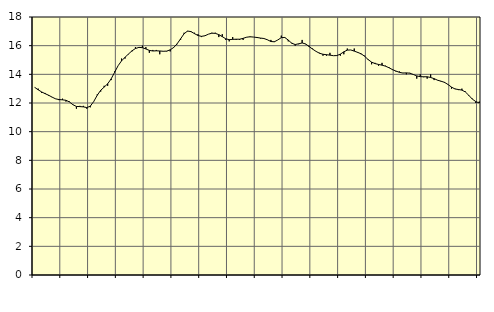
| Category | Piggar | Series 1 |
|---|---|---|
| nan | 13.1 | 13.09 |
| 87.0 | 13 | 12.92 |
| 87.0 | 12.7 | 12.77 |
| 87.0 | 12.7 | 12.65 |
| nan | 12.5 | 12.54 |
| 88.0 | 12.4 | 12.41 |
| 88.0 | 12.3 | 12.29 |
| 88.0 | 12.2 | 12.24 |
| nan | 12.3 | 12.22 |
| 89.0 | 12.1 | 12.19 |
| 89.0 | 12.1 | 12.07 |
| 89.0 | 11.9 | 11.88 |
| nan | 11.6 | 11.76 |
| 90.0 | 11.8 | 11.75 |
| 90.0 | 11.8 | 11.73 |
| 90.0 | 11.6 | 11.68 |
| nan | 11.7 | 11.78 |
| 91.0 | 12.1 | 12.11 |
| 91.0 | 12.6 | 12.54 |
| 91.0 | 12.8 | 12.89 |
| nan | 13.2 | 13.11 |
| 92.0 | 13.2 | 13.34 |
| 92.0 | 13.6 | 13.68 |
| 92.0 | 14.2 | 14.14 |
| nan | 14.6 | 14.6 |
| 93.0 | 15.1 | 14.94 |
| 93.0 | 15.1 | 15.19 |
| 93.0 | 15.4 | 15.42 |
| nan | 15.6 | 15.64 |
| 94.0 | 15.9 | 15.8 |
| 94.0 | 15.9 | 15.88 |
| 94.0 | 16 | 15.86 |
| nan | 15.9 | 15.77 |
| 95.0 | 15.5 | 15.67 |
| 95.0 | 15.7 | 15.63 |
| 95.0 | 15.7 | 15.64 |
| nan | 15.4 | 15.63 |
| 96.0 | 15.6 | 15.61 |
| 96.0 | 15.6 | 15.62 |
| 96.0 | 15.6 | 15.71 |
| nan | 15.9 | 15.87 |
| 97.0 | 16.1 | 16.13 |
| 97.0 | 16.4 | 16.48 |
| 97.0 | 16.9 | 16.83 |
| nan | 17 | 17.02 |
| 98.0 | 17 | 16.98 |
| 98.0 | 16.9 | 16.84 |
| 98.0 | 16.8 | 16.71 |
| nan | 16.6 | 16.65 |
| 99.0 | 16.7 | 16.69 |
| 99.0 | 16.8 | 16.8 |
| 99.0 | 16.9 | 16.87 |
| nan | 16.9 | 16.86 |
| 0.0 | 16.6 | 16.77 |
| 0.0 | 16.8 | 16.63 |
| 0.0 | 16.4 | 16.48 |
| nan | 16.3 | 16.42 |
| 1.0 | 16.6 | 16.44 |
| 1.0 | 16.4 | 16.45 |
| 1.0 | 16.4 | 16.45 |
| nan | 16.4 | 16.51 |
| 2.0 | 16.6 | 16.59 |
| 2.0 | 16.6 | 16.62 |
| 2.0 | 16.6 | 16.6 |
| nan | 16.6 | 16.57 |
| 3.0 | 16.5 | 16.53 |
| 3.0 | 16.5 | 16.5 |
| 3.0 | 16.4 | 16.41 |
| nan | 16.4 | 16.29 |
| 4.0 | 16.3 | 16.27 |
| 4.0 | 16.4 | 16.4 |
| 4.0 | 16.7 | 16.56 |
| nan | 16.6 | 16.57 |
| 5.0 | 16.3 | 16.39 |
| 5.0 | 16.2 | 16.17 |
| 5.0 | 16 | 16.08 |
| nan | 16.1 | 16.13 |
| 6.0 | 16.4 | 16.19 |
| 6.0 | 16.1 | 16.12 |
| 6.0 | 16 | 15.94 |
| nan | 15.8 | 15.76 |
| 7.0 | 15.6 | 15.6 |
| 7.0 | 15.5 | 15.47 |
| 7.0 | 15.3 | 15.4 |
| nan | 15.3 | 15.37 |
| 8.0 | 15.5 | 15.34 |
| 8.0 | 15.3 | 15.3 |
| 8.0 | 15.3 | 15.31 |
| nan | 15.3 | 15.41 |
| 9.0 | 15.4 | 15.57 |
| 9.0 | 15.8 | 15.69 |
| 9.0 | 15.7 | 15.7 |
| nan | 15.8 | 15.62 |
| 10.0 | 15.5 | 15.53 |
| 10.0 | 15.4 | 15.43 |
| 10.0 | 15.3 | 15.26 |
| nan | 15 | 15.03 |
| 11.0 | 14.7 | 14.85 |
| 11.0 | 14.8 | 14.75 |
| 11.0 | 14.6 | 14.69 |
| nan | 14.8 | 14.64 |
| 12.0 | 14.6 | 14.57 |
| 12.0 | 14.5 | 14.46 |
| 12.0 | 14.3 | 14.33 |
| nan | 14.2 | 14.23 |
| 13.0 | 14.2 | 14.14 |
| 13.0 | 14.1 | 14.09 |
| 13.0 | 14 | 14.1 |
| nan | 14.1 | 14.08 |
| 14.0 | 14 | 13.99 |
| 14.0 | 13.7 | 13.89 |
| 14.0 | 14 | 13.84 |
| nan | 13.8 | 13.83 |
| 15.0 | 13.7 | 13.83 |
| 15.0 | 14 | 13.78 |
| 15.0 | 13.6 | 13.7 |
| nan | 13.6 | 13.59 |
| 16.0 | 13.5 | 13.52 |
| 16.0 | 13.4 | 13.44 |
| 16.0 | 13.3 | 13.29 |
| nan | 13 | 13.11 |
| 17.0 | 13 | 12.98 |
| 17.0 | 12.9 | 12.94 |
| 17.0 | 13 | 12.9 |
| nan | 12.8 | 12.77 |
| 18.0 | 12.5 | 12.53 |
| 18.0 | 12.3 | 12.27 |
| 18.0 | 12 | 12.1 |
| nan | 12.1 | 12 |